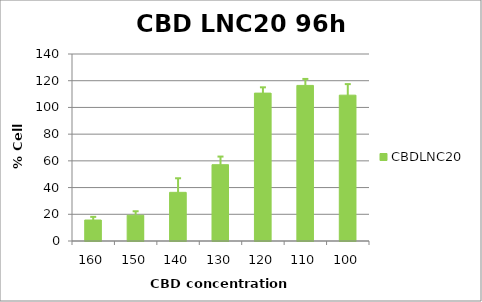
| Category | CBDLNC20 |
|---|---|
| 160.0 | 15.703 |
| 150.0 | 19.28 |
| 140.0 | 36.437 |
| 130.0 | 57.123 |
| 120.0 | 110.711 |
| 110.0 | 116.483 |
| 100.0 | 109.188 |